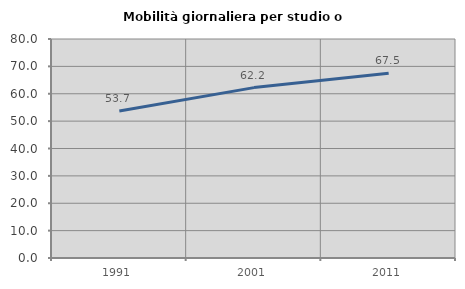
| Category | Mobilità giornaliera per studio o lavoro |
|---|---|
| 1991.0 | 53.713 |
| 2001.0 | 62.243 |
| 2011.0 | 67.509 |